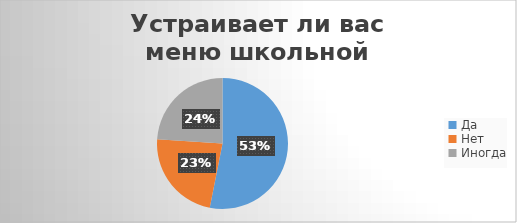
| Category | Series 0 |
|---|---|
| Да | 51 |
| Нет | 22 |
| Иногда | 23 |